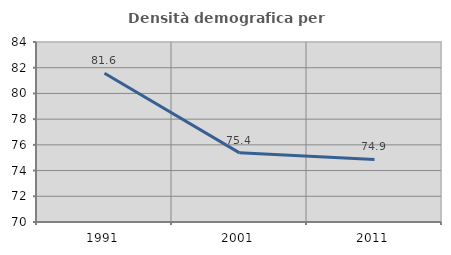
| Category | Densità demografica |
|---|---|
| 1991.0 | 81.566 |
| 2001.0 | 75.378 |
| 2011.0 | 74.862 |